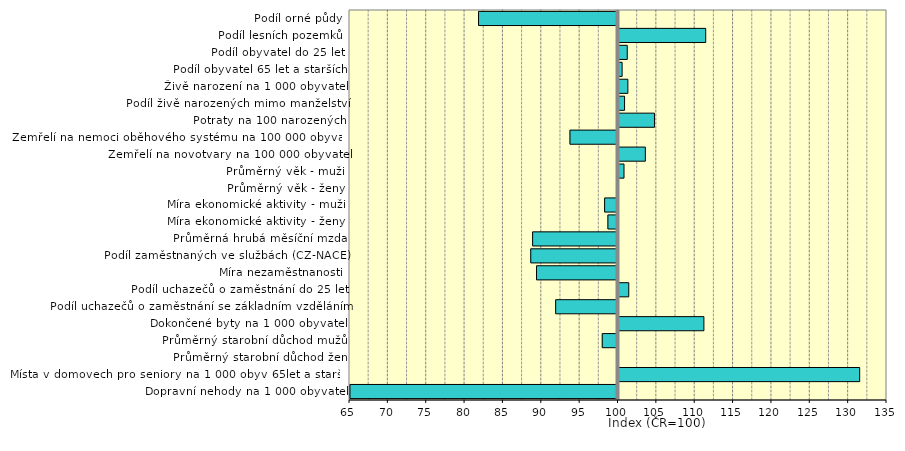
| Category | Series 0 |
|---|---|
| Dopravní nehody na 1 000 obyvatel | 65.059 |
| Místa v domovech pro seniory na 1 000 obyv 65let a starších | 131.439 |
| Průměrný starobní důchod žen | 99.914 |
| Průměrný starobní důchod mužů | 97.948 |
| Dokončené byty na 1 000 obyvatel | 111.133 |
| Podíl uchazečů o zaměstnání se základním vzděláním | 91.875 |
| Podíl uchazečů o zaměstnání do 25 let | 101.338 |
| Míra nezaměstnanosti | 89.379 |
| Podíl zaměstnaných ve službách (CZ-NACE) | 88.628 |
| Průměrná hrubá měsíční mzda | 88.87 |
| Míra ekonomické aktivity - ženy | 98.684 |
| Míra ekonomické aktivity - muži | 98.256 |
| Průměrný věk - ženy | 99.888 |
| Průměrný věk - muži | 100.718 |
| Zemřelí na novotvary na 100 000 obyvatel | 103.5 |
| Zemřelí na nemoci oběhového systému na 100 000 obyvatel | 93.738 |
| Potraty na 100 narozených | 104.69 |
| Podíl živě narozených mimo manželství | 100.79 |
| Živě narození na 1 000 obyvatel | 101.221 |
| Podíl obyvatel 65 let a starších | 100.472 |
| Podíl obyvatel do 25 let | 101.141 |
| Podíl lesních pozemků | 111.367 |
| Podíl orné půdy | 81.82 |